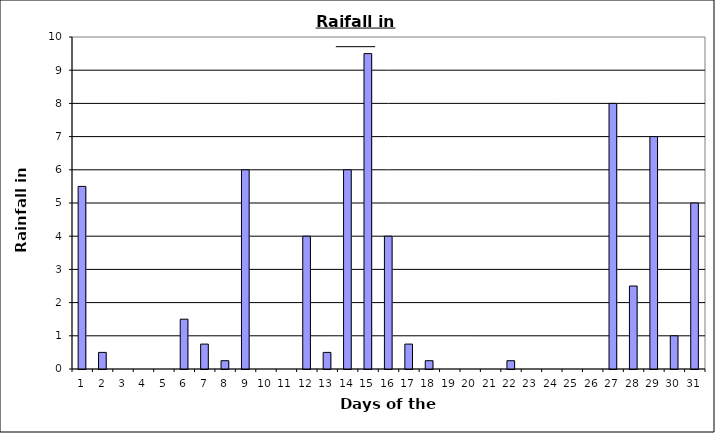
| Category | Series 0 |
|---|---|
| 0 | 5.5 |
| 1 | 0.5 |
| 2 | 0 |
| 3 | 0 |
| 4 | 0 |
| 5 | 1.5 |
| 6 | 0.75 |
| 7 | 0.25 |
| 8 | 6 |
| 9 | 0 |
| 10 | 0 |
| 11 | 4 |
| 12 | 0.5 |
| 13 | 6 |
| 14 | 9.5 |
| 15 | 4 |
| 16 | 0.75 |
| 17 | 0.25 |
| 18 | 0 |
| 19 | 0 |
| 20 | 0 |
| 21 | 0.25 |
| 22 | 0 |
| 23 | 0 |
| 24 | 0 |
| 25 | 0 |
| 26 | 8 |
| 27 | 2.5 |
| 28 | 7 |
| 29 | 1 |
| 30 | 5 |